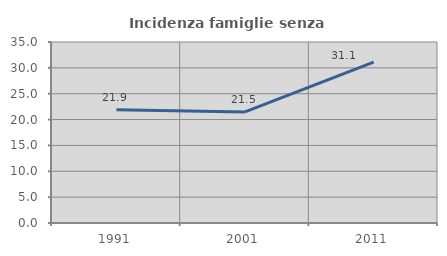
| Category | Incidenza famiglie senza nuclei |
|---|---|
| 1991.0 | 21.88 |
| 2001.0 | 21.478 |
| 2011.0 | 31.114 |